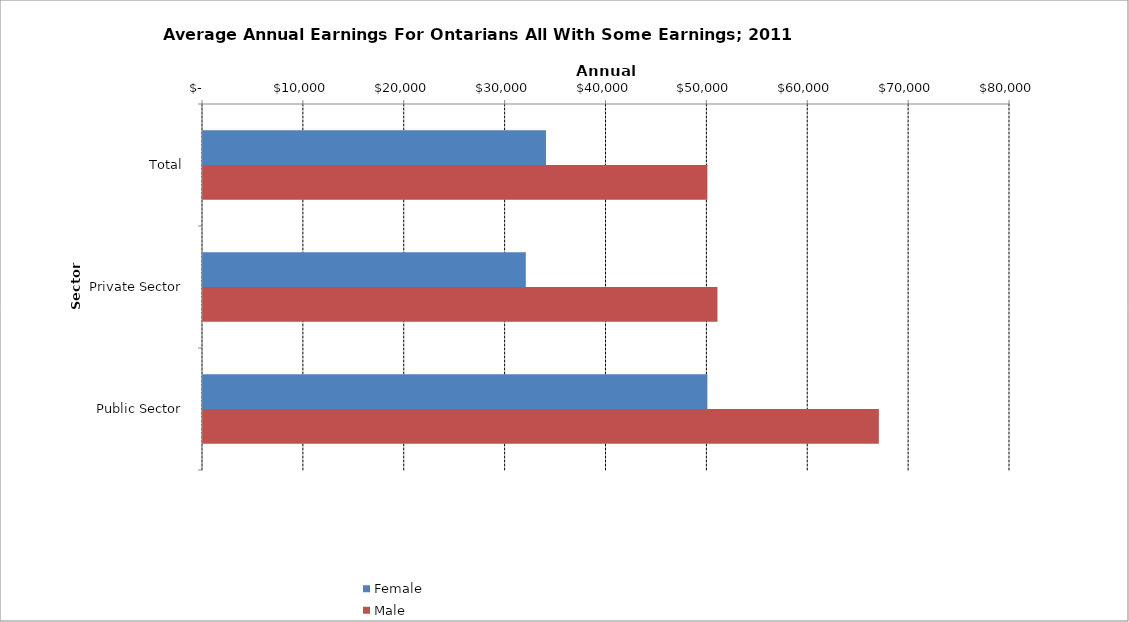
| Category | Female | Male |
|---|---|---|
| Total | 34000 | 50000 |
|  Private Sector  | 32000 | 51000 |
|  Public Sector  | 50000 | 67000 |